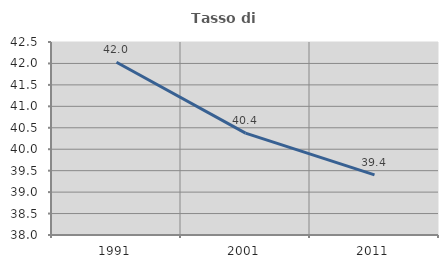
| Category | Tasso di occupazione   |
|---|---|
| 1991.0 | 42.029 |
| 2001.0 | 40.377 |
| 2011.0 | 39.402 |